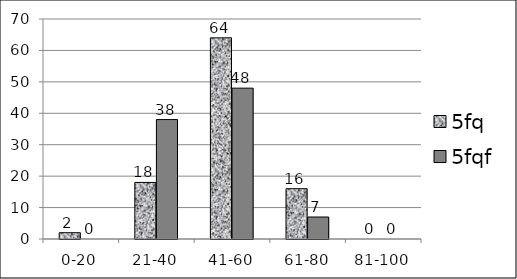
| Category | 5fq | 5fqf |
|---|---|---|
| 0-20 | 2 | 0 |
| 21-40 | 18 | 38 |
| 41-60 | 64 | 48 |
| 61-80 | 16 | 7 |
| 81-100 | 0 | 0 |